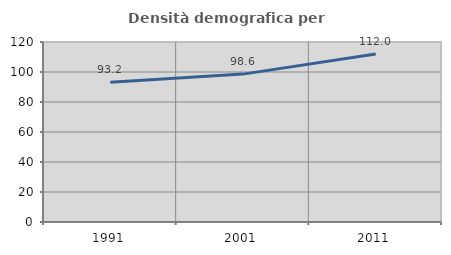
| Category | Densità demografica |
|---|---|
| 1991.0 | 93.23 |
| 2001.0 | 98.586 |
| 2011.0 | 111.961 |